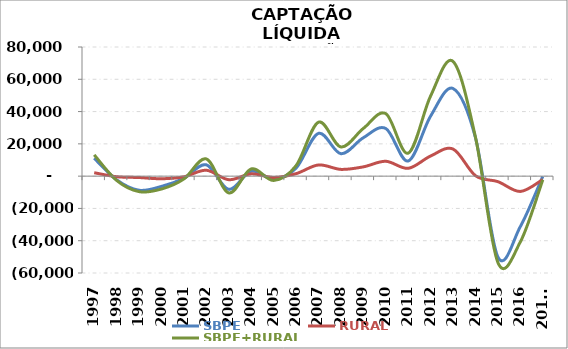
| Category | SBPE | RURAL | SBPE+RURAL |
|---|---|---|---|
| 1997 | 11079 | 2113.852 | 13192.852 |
| 1998 | -2301.5 | -361.228 | -2662.728 |
| 1999 | -8740.2 | -858.508 | -9598.708 |
| 2000 | -6355.964 | -1615.457 | -7971.421 |
| 2001 | -1319.381 | -412.963 | -1732.344 |
| 2002 | 7008.282 | 3649.972 | 10658.254 |
| 2003 | -8178.886 | -2213.868 | -10392.754 |
| 2004 | 3057.299 | 1425.147 | 4482.446 |
| 2005 | -1869.531 | -826.948 | -2696.479 |
| 2006 | 4963.736 | 1532.919 | 6496.655 |
| 2007 | 26493.6 | 6927.358 | 33420.958 |
| 2008 | 13900.71 | 4187.043 | 18087.753 |
| 2009 | 23813.033 | 5752.651 | 29565.684 |
| 2010 | 29513.472 | 9213.301 | 38726.773 |
| 2011 | 9382.932 | 4844.657 | 14227.589 |
| 2012 | 37239.575 | 12479.984 | 49719.559 |
| 2013 | 54280.749 | 16766.843 | 71047.592 |
| 2014 | 23758.558 | 275.423 | 24033.981 |
| 2015 | -50149.363 | -3418.504 | -53567.867 |
| 2016 | -31222.546 | -9479.207 | -40701.753 |
| 2017* | -183.687 | -2062.668 | -2246.355 |